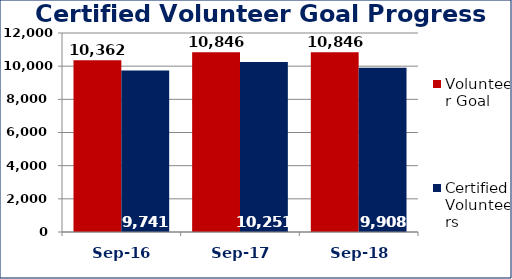
| Category | Volunteer Goal  | Certified Volunteers  |
|---|---|---|
| Sep-16 | 10362 | 9741 |
| Sep-17 | 10846 | 10251 |
| Sep-18 | 10846 | 9908 |